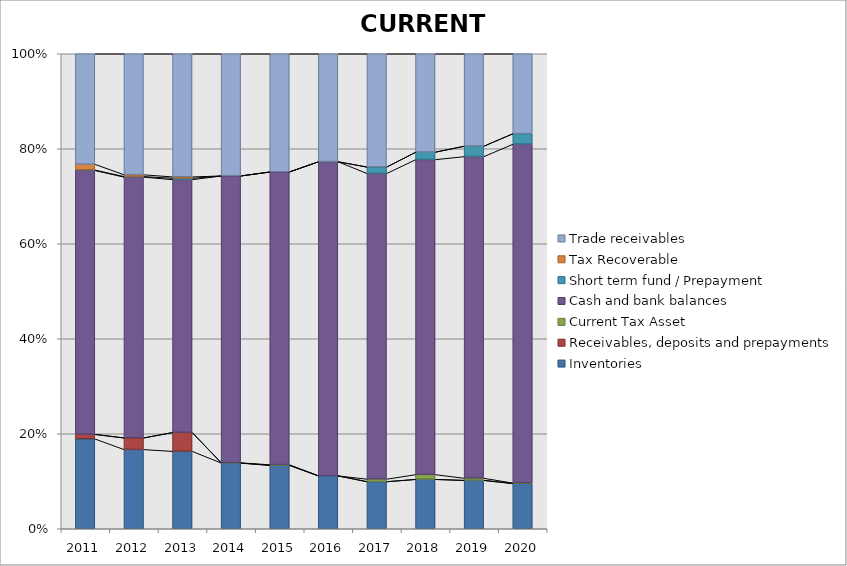
| Category | Inventories  | Receivables, deposits and prepayments | Current Tax Asset | Cash and bank balances | Short term fund / Prepayment | Tax Recoverable | Trade receivables |
|---|---|---|---|---|---|---|---|
| 2011.0 | 18866856 | 964972 | 0 | 55350629 | 93164 | 1205418 | 23152108 |
| 2012.0 | 17221363 | 2528621 | 0 | 56591062 | 114172 | 383986 | 26221654 |
| 2013.0 | 19893955 | 4844448 | 0 | 64862901 | 350627 | 349209 | 31535322 |
| 2014.0 | 18790244 | 0 | 65252 | 81798844 | 0 | 0 | 34777229 |
| 2015.0 | 19362334 | 0 | 185889 | 89140666 | 0 | 0 | 35931082 |
| 2016.0 | 18148402 | 0 | 0 | 107379673 | 0 | 0 | 36836248 |
| 2017.0 | 15847951 | 0 | 839423 | 102503750 | 2179277 | 0 | 37934506 |
| 2018.0 | 14902914 | 0 | 1441285 | 94766556 | 2250928 | 0 | 29553782 |
| 2019.0 | 15612549 | 0 | 678976 | 103399520 | 3361395 | 0 | 29646069 |
| 2020.0 | 14970305 | 0 | 157091 | 111692231 | 3469990 | 0 | 26290658 |